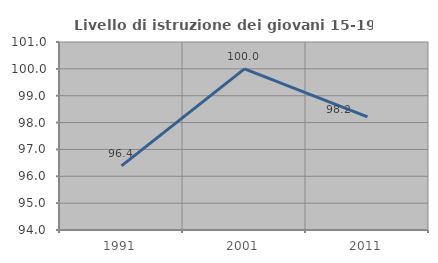
| Category | Livello di istruzione dei giovani 15-19 anni |
|---|---|
| 1991.0 | 96.386 |
| 2001.0 | 100 |
| 2011.0 | 98.214 |